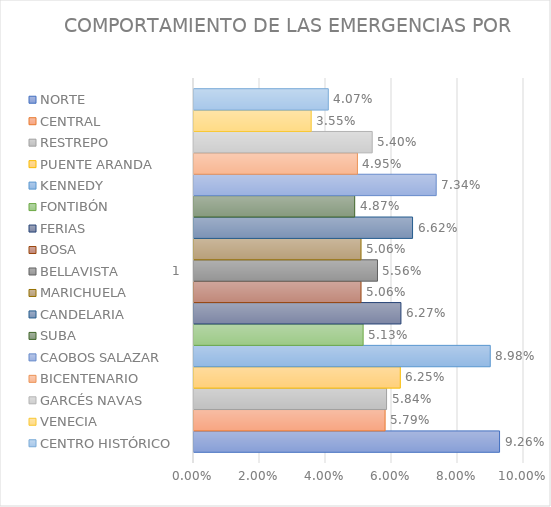
| Category | NORTE | CENTRAL | RESTREPO | PUENTE ARANDA | KENNEDY | FONTIBÓN | FERIAS | BOSA | BELLAVISTA | MARICHUELA | CANDELARIA | SUBA | CAOBOS SALAZAR | BICENTENARIO | GARCÉS NAVAS | VENECIA | CENTRO HISTÓRICO |
|---|---|---|---|---|---|---|---|---|---|---|---|---|---|---|---|---|---|
| 0 | 0.093 | 0.058 | 0.058 | 0.063 | 0.09 | 0.051 | 0.063 | 0.051 | 0.056 | 0.051 | 0.066 | 0.049 | 0.073 | 0.05 | 0.054 | 0.036 | 0.041 |